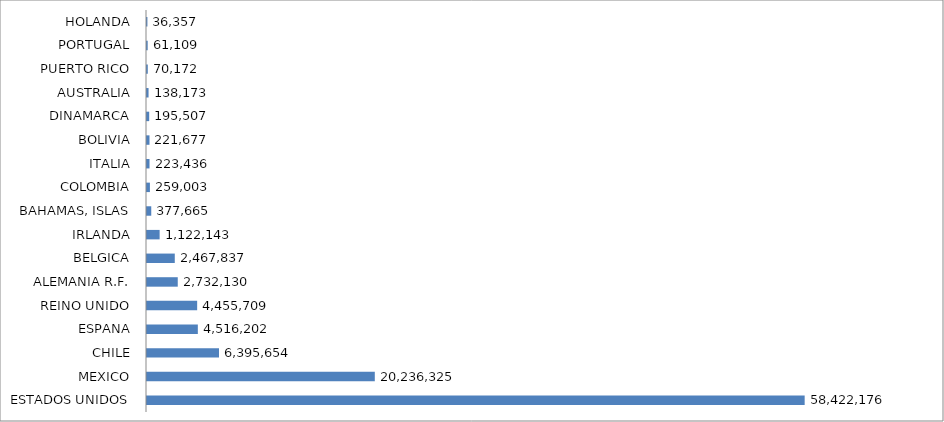
| Category | FOB U$S |
|---|---|
| ESTADOS UNIDOS | 58422176.02 |
| MEXICO | 20236325.2 |
| CHILE | 6395653.72 |
| ESPANA | 4516201.93 |
| REINO UNIDO | 4455708.9 |
| ALEMANIA R.F. | 2732130.32 |
| BELGICA | 2467837.35 |
| IRLANDA | 1122142.87 |
| BAHAMAS, ISLAS | 377665.2 |
| COLOMBIA | 259003.31 |
| ITALIA | 223436.2 |
| BOLIVIA | 221677.04 |
| DINAMARCA | 195506.85 |
| AUSTRALIA | 138172.85 |
| PUERTO RICO | 70172.11 |
| PORTUGAL | 61109.05 |
| HOLANDA | 36356.6 |